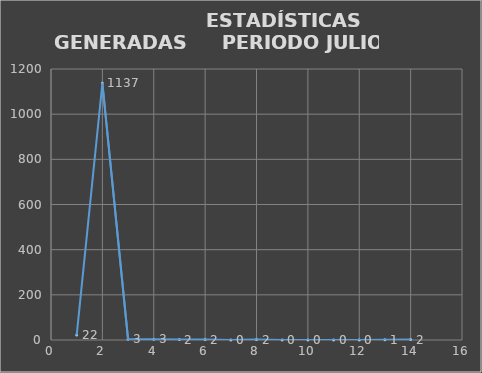
| Category |                   ESTADÍSTICAS GENERADAS  |
|---|---|
| 0 | 22 |
| 1 | 1137 |
| 2 | 3 |
| 3 | 3 |
| 4 | 2 |
| 5 | 2 |
| 6 | 0 |
| 7 | 2 |
| 8 | 0 |
| 9 | 0 |
| 10 | 0 |
| 11 | 0 |
| 12 | 1 |
| 13 | 2 |